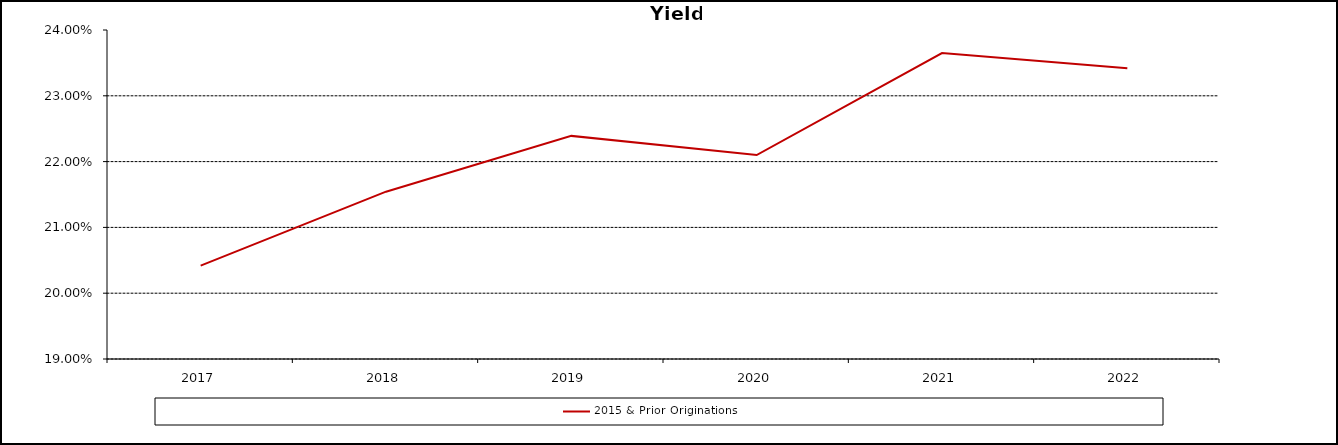
| Category | 2015 & Prior Originations |
|---|---|
| 2017.0 | 0.204 |
| 2018.0 | 0.215 |
| 2019.0 | 0.224 |
| 2020.0 | 0.221 |
| 2021.0 | 0.236 |
| 2022.0 | 0.234 |